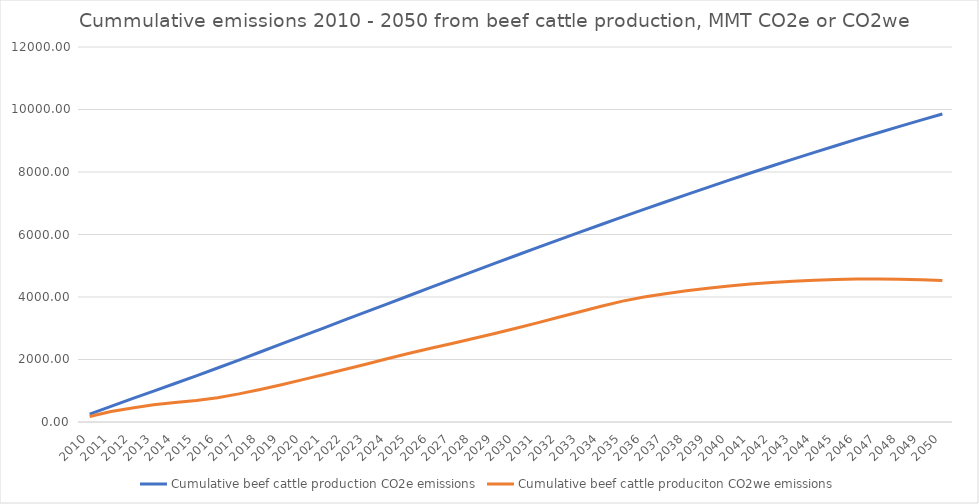
| Category | Cumulative beef cattle production CO2e emissions | Cumulative beef cattle produciton CO2we emissions |
|---|---|---|
| 2010.0 | 251.697 | 174.906 |
| 2011.0 | 500.417 | 333.033 |
| 2012.0 | 745.947 | 451.112 |
| 2013.0 | 990.213 | 549.985 |
| 2014.0 | 1232.688 | 623.138 |
| 2015.0 | 1477.014 | 684.603 |
| 2016.0 | 1727.394 | 775.608 |
| 2017.0 | 1982.008 | 900.433 |
| 2018.0 | 2239.248 | 1042.858 |
| 2019.0 | 2497.684 | 1194.039 |
| 2020.0 | 2756.12 | 1356.53 |
| 2021.0 | 3014.556 | 1522.591 |
| 2022.0 | 3272.992 | 1688.652 |
| 2023.0 | 3531.429 | 1854.594 |
| 2024.0 | 3789.865 | 2030.89 |
| 2025.0 | 4048.301 | 2200.64 |
| 2026.0 | 4305.879 | 2359.915 |
| 2027.0 | 4562.605 | 2513.363 |
| 2028.0 | 4818.486 | 2671.466 |
| 2029.0 | 5073.527 | 2833.634 |
| 2030.0 | 5327.734 | 3000.353 |
| 2031.0 | 5579.521 | 3172.893 |
| 2032.0 | 5828.912 | 3351.447 |
| 2033.0 | 6075.929 | 3528.236 |
| 2034.0 | 6320.598 | 3705.357 |
| 2035.0 | 6562.941 | 3867.175 |
| 2036.0 | 6802.982 | 3997.696 |
| 2037.0 | 7040.744 | 4104.846 |
| 2038.0 | 7276.25 | 4196.431 |
| 2039.0 | 7509.522 | 4276.566 |
| 2040.0 | 7740.582 | 4349.844 |
| 2041.0 | 7967.915 | 4412.494 |
| 2042.0 | 8191.586 | 4464.685 |
| 2043.0 | 8411.659 | 4506.583 |
| 2044.0 | 8628.195 | 4538.35 |
| 2045.0 | 8841.256 | 4560.146 |
| 2046.0 | 9050.903 | 4572.534 |
| 2047.0 | 9257.195 | 4575.666 |
| 2048.0 | 9460.189 | 4569.692 |
| 2049.0 | 9659.943 | 4554.761 |
| 2050.0 | 9856.514 | 4531.02 |